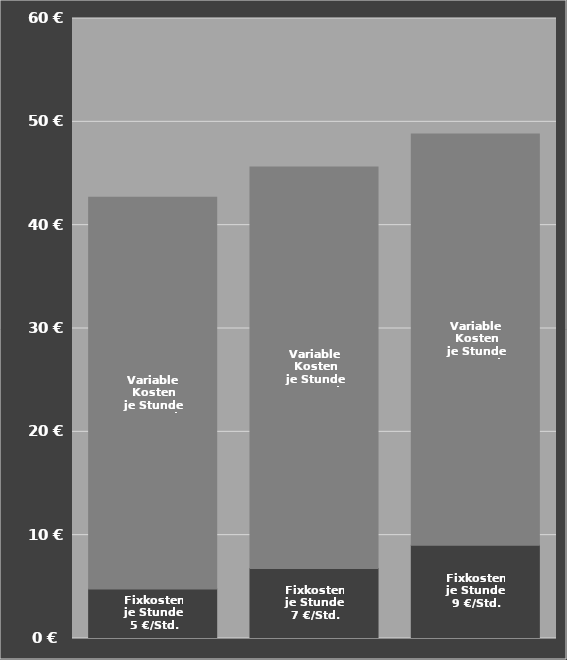
| Category | Fixkosten
je Stunde | Variable Kosten
je Stunde |
|---|---|---|
| Trecker 65 PS | 4.796 | 37.9 |
| Trecker 90 PS | 6.771 | 38.85 |
| Trecker 120 PS | 9.028 | 39.8 |